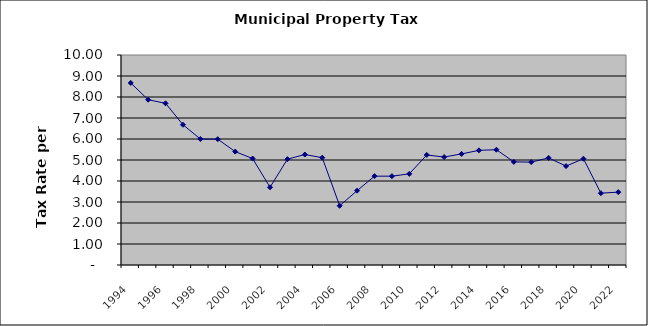
| Category | Rate |
|---|---|
| 1994.0 | 8.67 |
| 1995.0 | 7.87 |
| 1996.0 | 7.7 |
| 1997.0 | 6.68 |
| 1998.0 | 6 |
| 1999.0 | 5.99 |
| 2000.0 | 5.4 |
| 2001.0 | 5.07 |
| 2002.0 | 3.7 |
| 2003.0 | 5.04 |
| 2004.0 | 5.26 |
| 2005.0 | 5.11 |
| 2006.0 | 2.82 |
| 2007.0 | 3.54 |
| 2008.0 | 4.23 |
| 2009.0 | 4.23 |
| 2010.0 | 4.34 |
| 2011.0 | 5.24 |
| 2012.0 | 5.14 |
| 2013.0 | 5.29 |
| 2014.0 | 5.46 |
| 2015.0 | 5.49 |
| 2016.0 | 4.91 |
| 2017.0 | 4.9 |
| 2018.0 | 5.1 |
| 2019.0 | 4.71 |
| 2020.0 | 5.06 |
| 2021.0 | 3.42 |
| 2022.0 | 3.47 |